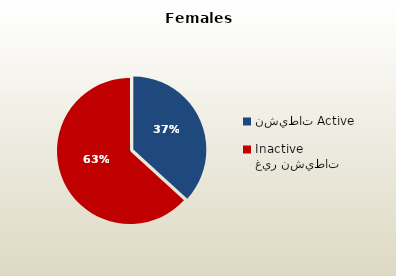
| Category | الاناث القطريات  Qatari Females |
|---|---|
| نشيطات Active | 39091 |
| غير نشيطات Inactive | 67259 |